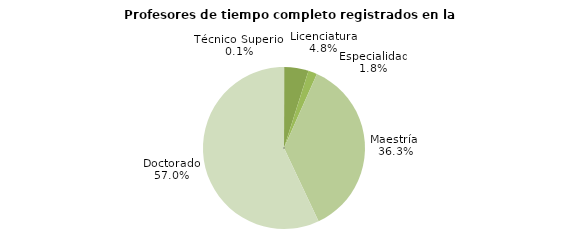
| Category | Series 0 |
|---|---|
| Técnico Superior | 1 |
| Licenciatura | 60 |
| Especialidad | 22 |
| Maestría  | 453 |
| Doctorado | 711 |